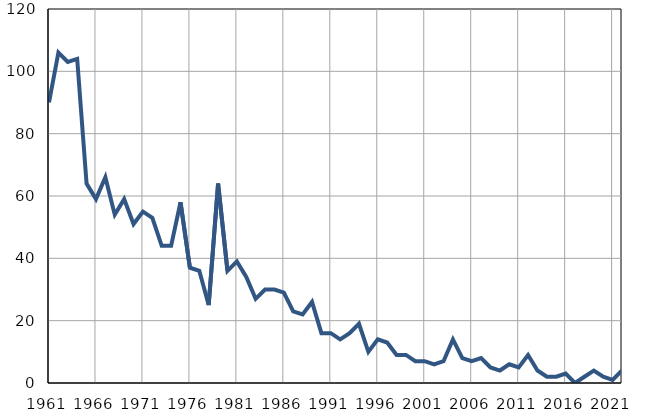
| Category | Умрла 
одојчад |
|---|---|
| 1961.0 | 90 |
| 1962.0 | 106 |
| 1963.0 | 103 |
| 1964.0 | 104 |
| 1965.0 | 64 |
| 1966.0 | 59 |
| 1967.0 | 66 |
| 1968.0 | 54 |
| 1969.0 | 59 |
| 1970.0 | 51 |
| 1971.0 | 55 |
| 1972.0 | 53 |
| 1973.0 | 44 |
| 1974.0 | 44 |
| 1975.0 | 58 |
| 1976.0 | 37 |
| 1977.0 | 36 |
| 1978.0 | 25 |
| 1979.0 | 64 |
| 1980.0 | 36 |
| 1981.0 | 39 |
| 1982.0 | 34 |
| 1983.0 | 27 |
| 1984.0 | 30 |
| 1985.0 | 30 |
| 1986.0 | 29 |
| 1987.0 | 23 |
| 1988.0 | 22 |
| 1989.0 | 26 |
| 1990.0 | 16 |
| 1991.0 | 16 |
| 1992.0 | 14 |
| 1993.0 | 16 |
| 1994.0 | 19 |
| 1995.0 | 10 |
| 1996.0 | 14 |
| 1997.0 | 13 |
| 1998.0 | 9 |
| 1999.0 | 9 |
| 2000.0 | 7 |
| 2001.0 | 7 |
| 2002.0 | 6 |
| 2003.0 | 7 |
| 2004.0 | 14 |
| 2005.0 | 8 |
| 2006.0 | 7 |
| 2007.0 | 8 |
| 2008.0 | 5 |
| 2009.0 | 4 |
| 2010.0 | 6 |
| 2011.0 | 5 |
| 2012.0 | 9 |
| 2013.0 | 4 |
| 2014.0 | 2 |
| 2015.0 | 2 |
| 2016.0 | 3 |
| 2017.0 | 0 |
| 2018.0 | 2 |
| 2019.0 | 4 |
| 2020.0 | 2 |
| 2021.0 | 1 |
| 2022.0 | 4 |